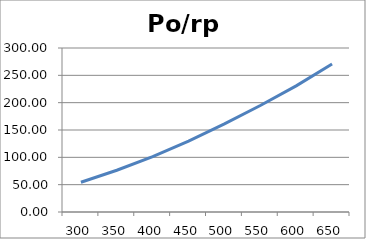
| Category | Po/rpm |
|---|---|
| 300.0 | 54.497 |
| 350.0 | 76.385 |
| 400.0 | 101.389 |
| 450.0 | 129.766 |
| 500.0 | 161.101 |
| 550.0 | 194.834 |
| 600.0 | 230.695 |
| 650.0 | 270.746 |